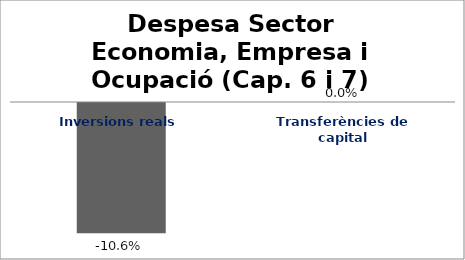
| Category | Series 0 |
|---|---|
| Inversions reals | -0.106 |
| Transferències de capital | 0 |